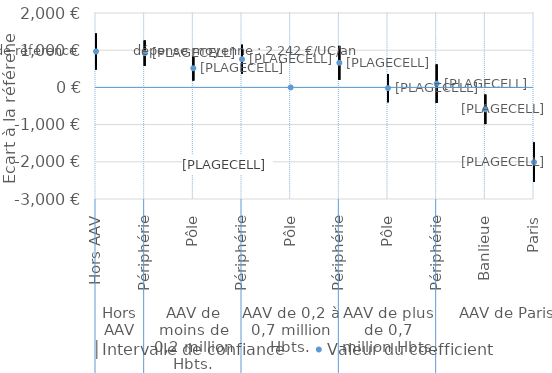
| Category | │Intervalle de confiance | Series 1 | Valeur du coefficient |
|---|---|---|---|
| 0 | 1447.474 | 484.338 | 965.906 |
| 1 | 1262.03 | 577.597 | 919.814 |
| 2 | 846.548 | 183.014 | 514.781 |
| 3 | 1144.332 | 373.131 | 758.731 |
| 4 | 0 | 0 | 0 |
| 5 | 1116.242 | 205.158 | 660.7 |
| 6 | 361.307 | -399.493 | -19.093 |
| 7 | 618.283 | -417.8 | 100.242 |
| 8 | -192.141 | -986.031 | -589.086 |
| 9 | -1480 | -2540 | -2010 |